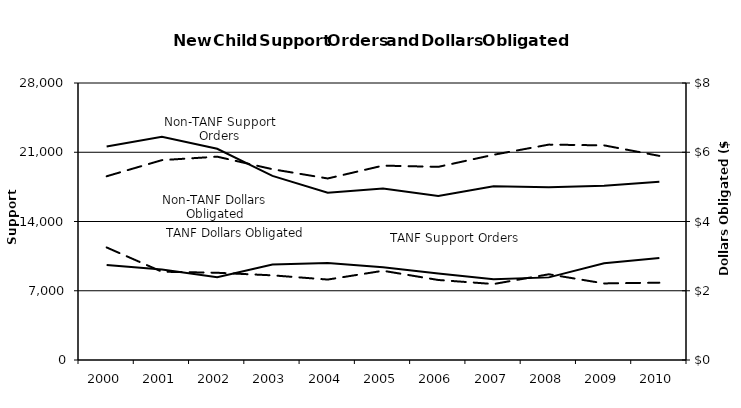
| Category | TANF Support Orders | Non_TANF Support Orders |
|---|---|---|
| 2000 | 9603 | 21590 |
| 2001 | 9138 | 22554 |
| 2002 | 8373 | 21353 |
| 2003 | 9650 | 18611 |
| 2004 | 9811 | 16914 |
| 2005 | 9365 | 17335 |
| 2006 | 8753 | 16584 |
| 2007 | 8162 | 17570 |
| 2008 | 8352 | 17461 |
| 2009 | 9780 | 17622 |
| 2010 | 10315 | 18019 |